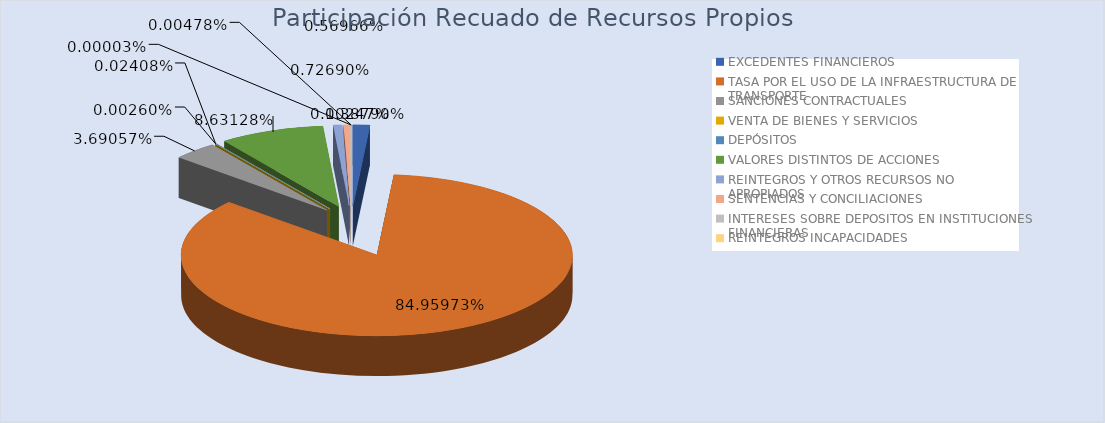
| Category | Total |
|---|---|
| EXCEDENTES FINANCIEROS | 1700 |
| TASA POR EL USO DE LA INFRAESTRUCTURA DE TRANSPORTE | 104064.481 |
| SANCIONES CONTRACTUALES | 4520.459 |
| VENTA DE BIENES Y SERVICIOS | 3.185 |
| DEPÓSITOS | 29.492 |
| VALORES DISTINTOS DE ACCIONES | 10572.18 |
| REINTEGROS Y OTROS RECURSOS NO APROPIADOS | 890.358 |
| SENTENCIAS Y CONCILIACIONES | 697.756 |
| INTERESES SOBRE DEPOSITOS EN INSTITUCIONES FINANCIERAS | 3.027 |
| REINTEGROS INCAPACIDADES | 5.851 |
| REINTEGROS GASTOS DE FUNCIONAMIENTO | 0.038 |